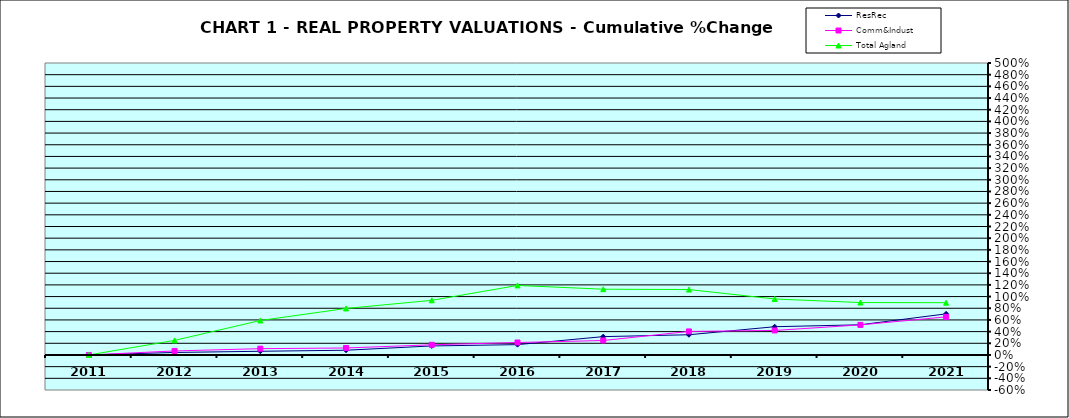
| Category | ResRec | Comm&Indust | Total Agland |
|---|---|---|---|
| 2011.0 | 0 | 0 | 0 |
| 2012.0 | 0.043 | 0.069 | 0.25 |
| 2013.0 | 0.063 | 0.108 | 0.59 |
| 2014.0 | 0.081 | 0.12 | 0.796 |
| 2015.0 | 0.154 | 0.174 | 0.936 |
| 2016.0 | 0.177 | 0.213 | 1.191 |
| 2017.0 | 0.314 | 0.248 | 1.126 |
| 2018.0 | 0.346 | 0.403 | 1.12 |
| 2019.0 | 0.484 | 0.42 | 0.959 |
| 2020.0 | 0.517 | 0.515 | 0.898 |
| 2021.0 | 0.704 | 0.652 | 0.895 |